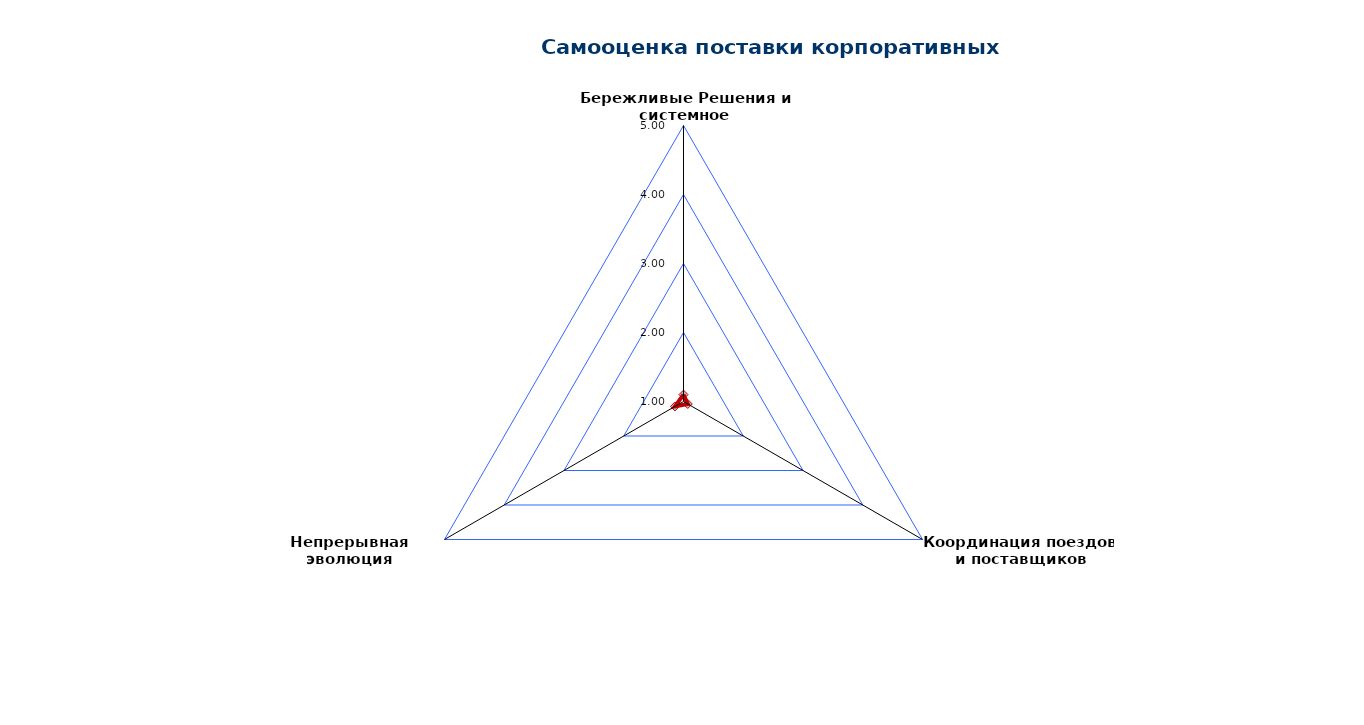
| Category | Поставка корпоративных решений |
|---|---|
| Бережливые Решения и системное проектирование | 1.1 |
| Координация поездов и поставщиков | 1.071 |
| Непрерывная эволюция работающих систем | 1.143 |